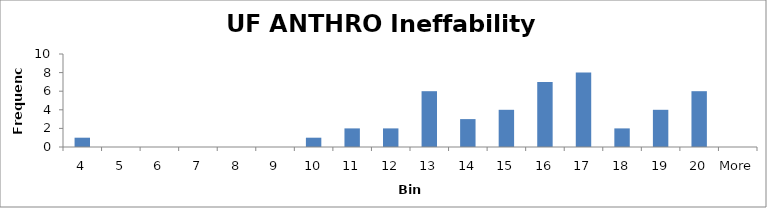
| Category | Frequency |
|---|---|
| 4 | 1 |
| 5 | 0 |
| 6 | 0 |
| 7 | 0 |
| 8 | 0 |
| 9 | 0 |
| 10 | 1 |
| 11 | 2 |
| 12 | 2 |
| 13 | 6 |
| 14 | 3 |
| 15 | 4 |
| 16 | 7 |
| 17 | 8 |
| 18 | 2 |
| 19 | 4 |
| 20 | 6 |
| More | 0 |